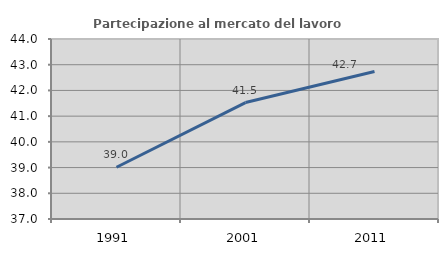
| Category | Partecipazione al mercato del lavoro  femminile |
|---|---|
| 1991.0 | 39.012 |
| 2001.0 | 41.528 |
| 2011.0 | 42.734 |